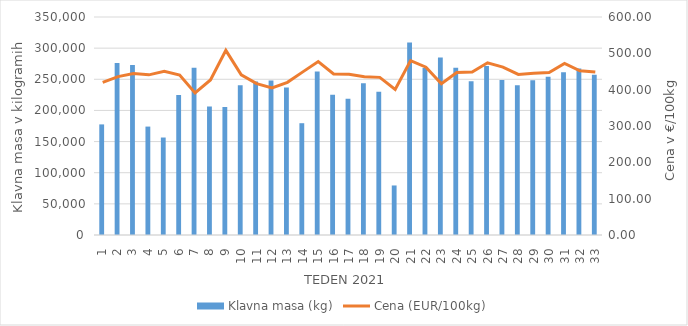
| Category | Klavna masa (kg) |
|---|---|
| 1.0 | 177573 |
| 2.0 | 275951 |
| 3.0 | 272797 |
| 4.0 | 174056 |
| 5.0 | 156508 |
| 6.0 | 224595 |
| 7.0 | 268436 |
| 8.0 | 206193 |
| 9.0 | 205669 |
| 10.0 | 240592 |
| 11.0 | 246325 |
| 12.0 | 248020 |
| 13.0 | 236703 |
| 14.0 | 179478 |
| 15.0 | 262544 |
| 16.0 | 225033 |
| 17.0 | 218950 |
| 18.0 | 243711 |
| 19.0 | 229955 |
| 20.0 | 79521 |
| 21.0 | 309134 |
| 22.0 | 268074 |
| 23.0 | 285151 |
| 24.0 | 268579 |
| 25.0 | 246944 |
| 26.0 | 271319 |
| 27.0 | 248858 |
| 28.0 | 240609 |
| 29.0 | 248383 |
| 30.0 | 253894 |
| 31.0 | 261374 |
| 32.0 | 267142 |
| 33.0 | 257352 |